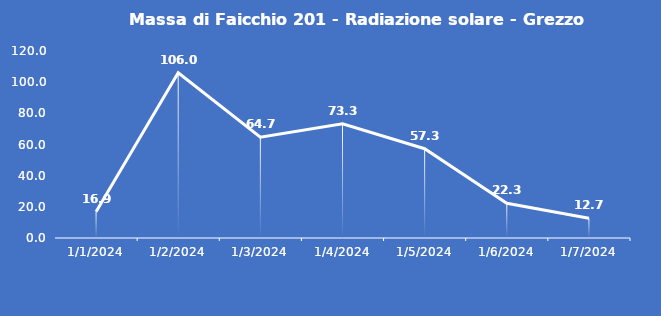
| Category | Massa di Faicchio 201 - Radiazione solare - Grezzo (W/m2) |
|---|---|
| 1/1/24 | 16.9 |
| 1/2/24 | 106 |
| 1/3/24 | 64.7 |
| 1/4/24 | 73.3 |
| 1/5/24 | 57.3 |
| 1/6/24 | 22.3 |
| 1/7/24 | 12.7 |